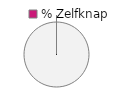
| Category | 5 - Zelfknap |
|---|---|
| 0 | 0 |
| 1 | 1 |